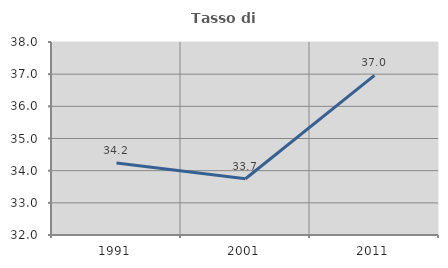
| Category | Tasso di occupazione   |
|---|---|
| 1991.0 | 34.237 |
| 2001.0 | 33.748 |
| 2011.0 | 36.963 |